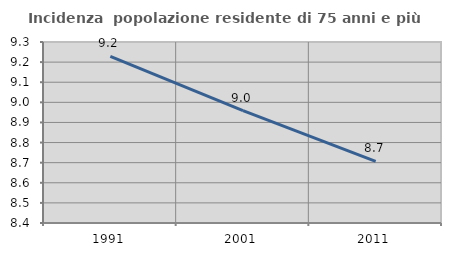
| Category | Incidenza  popolazione residente di 75 anni e più |
|---|---|
| 1991.0 | 9.229 |
| 2001.0 | 8.958 |
| 2011.0 | 8.707 |